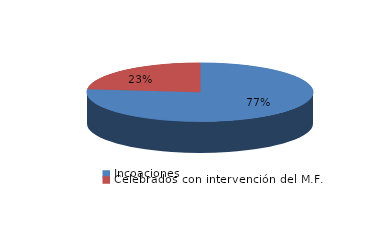
| Category | Series 0 |
|---|---|
| Incoaciones | 4511 |
| Celebrados con intervención del M.F. | 1380 |